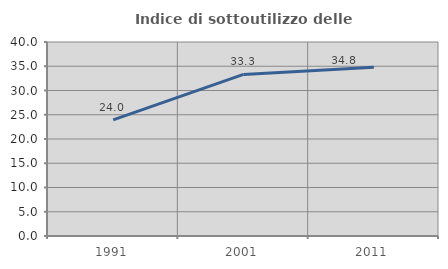
| Category | Indice di sottoutilizzo delle abitazioni  |
|---|---|
| 1991.0 | 23.95 |
| 2001.0 | 33.317 |
| 2011.0 | 34.816 |